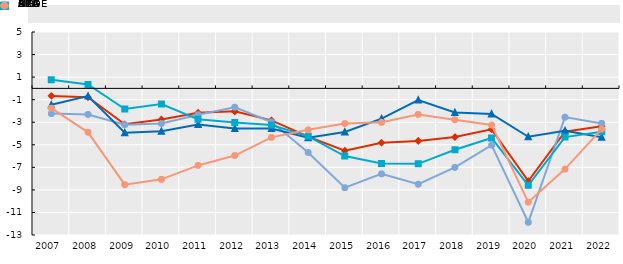
| Category | ALC | BRA | MEX | ARG | OCDE |
|---|---|---|---|---|---|
| 2007.0 | -0.665 | -2.232 | -1.458 | 0.757 | -1.757 |
| 2008.0 | -0.789 | -2.315 | -0.681 | 0.352 | -3.895 |
| 2009.0 | -3.182 | -3.22 | -3.935 | -1.83 | -8.539 |
| 2010.0 | -2.753 | -3.107 | -3.804 | -1.393 | -8.066 |
| 2011.0 | -2.151 | -2.337 | -3.204 | -2.746 | -6.831 |
| 2012.0 | -2.038 | -1.67 | -3.566 | -3.018 | -5.956 |
| 2013.0 | -2.835 | -2.979 | -3.559 | -3.254 | -4.343 |
| 2014.0 | -4.281 | -5.686 | -4.371 | -4.252 | -3.67 |
| 2015.0 | -5.529 | -8.801 | -3.859 | -6.001 | -3.122 |
| 2016.0 | -4.819 | -7.582 | -2.681 | -6.655 | -3.007 |
| 2017.0 | -4.655 | -8.498 | -1.034 | -6.693 | -2.313 |
| 2018.0 | -4.316 | -7.009 | -2.139 | -5.441 | -2.785 |
| 2019.0 | -3.628 | -5.032 | -2.264 | -4.395 | -3.248 |
| 2020.0 | -8.217 | -11.87 | -4.291 | -8.588 | -10.092 |
| 2021.0 | -3.838 | -2.545 | -3.758 | -4.321 | -7.155 |
| 2022.0 | -3.358 | -3.105 | -4.326 | -3.849 | -3.606 |